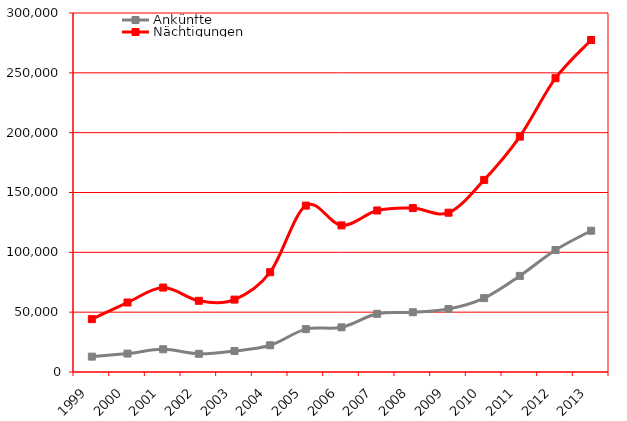
| Category | Ankünfte | Nächtigungen |
|---|---|---|
| 1999 | 12844 | 44180 |
| 2000 | 15396 | 58070 |
| 2001 | 19017 | 70560 |
| 2002 | 15202 | 59501 |
| 2003 | 17584 | 60499 |
| 2004 | 22348 | 83392 |
| 2005 | 35839 | 139043 |
| 2006 | 37319 | 122506 |
| 2007 | 48629 | 134963 |
| 2008 | 49940 | 136995 |
| 2009 | 52625 | 133127 |
| 2010 | 61753 | 160532 |
| 2011 | 80308 | 196672 |
| 2012 | 101964 | 245526 |
| 2013 | 118058 | 277436 |